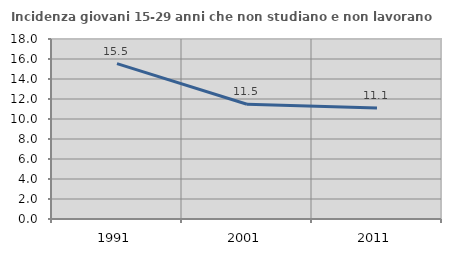
| Category | Incidenza giovani 15-29 anni che non studiano e non lavorano  |
|---|---|
| 1991.0 | 15.54 |
| 2001.0 | 11.475 |
| 2011.0 | 11.111 |